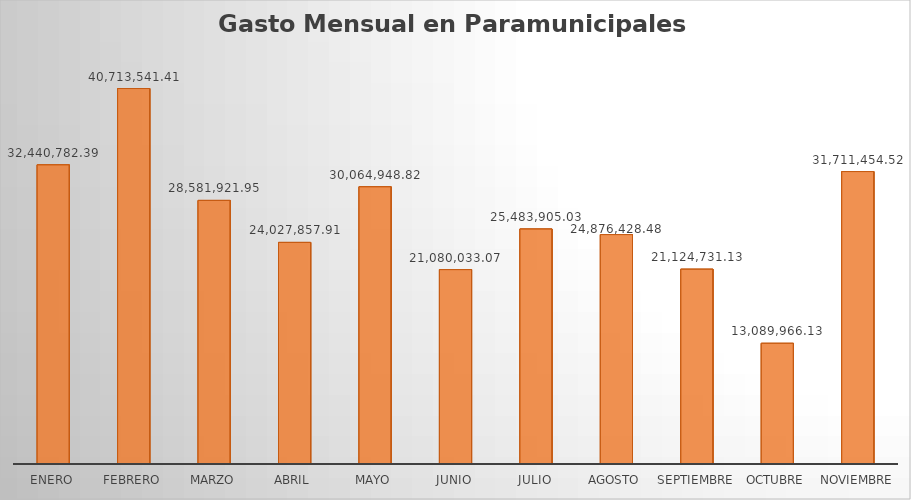
| Category | Monto |
|---|---|
| ENERO | 32440782.39 |
| FEBRERO | 40713541.41 |
| MARZO | 28581921.95 |
| ABRIL | 24027857.91 |
| MAYO | 30064948.82 |
| JUNIO | 21080033.07 |
| JULIO | 25483905.03 |
| AGOSTO | 24876428.48 |
| SEPTIEMBRE | 21124731.13 |
| OCTUBRE | 13089966.13 |
| NOVIEMBRE | 31711454.52 |